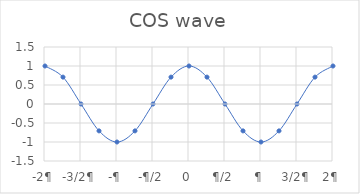
| Category | Series 1 |
|---|---|
| -2¶ | 1 |
|  | 0.707 |
| -3/2¶ | 0 |
|  | -0.707 |
| -¶ | -1 |
|  | -0.707 |
| -¶/2 | 0 |
|  | 0.707 |
| 0 | 1 |
|  | 0.707 |
| ¶/2 | 0 |
|  | -0.707 |
| ¶ | -1 |
|  | -0.707 |
| 3/2¶ | 0 |
|  | 0.707 |
| 2¶ | 1 |